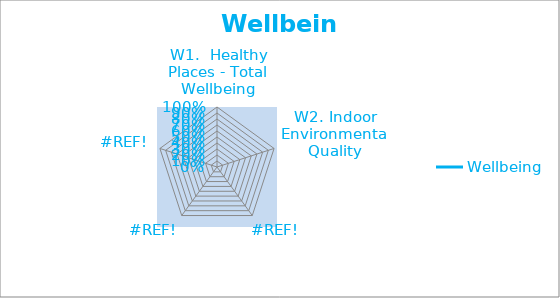
| Category | Wellbeing |
|---|---|
| W1.  Healthy Places - Total Wellbeing | 0 |
| W2. Indoor Environmental Quality | 0 |
| #REF! | 0 |
| #REF! | 0 |
| #REF! | 0 |